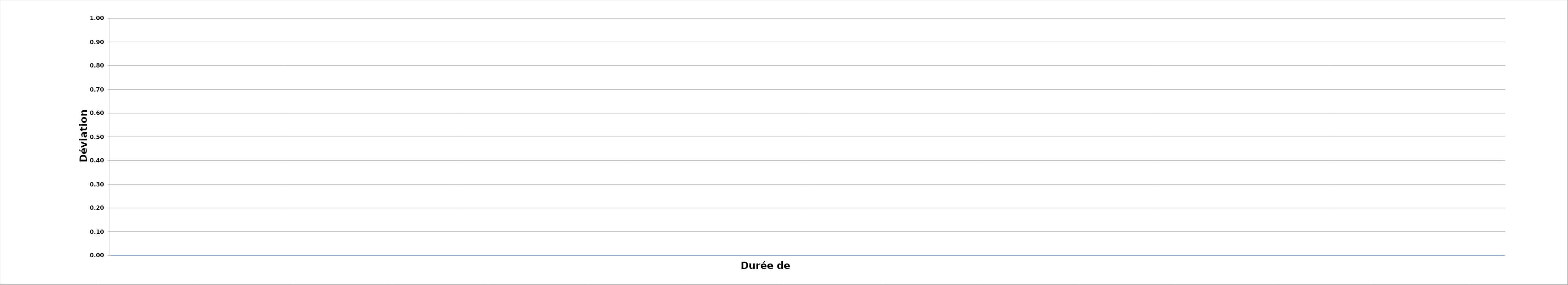
| Category | Series 0 |
|---|---|
| 0 | 0 |
| 1 | 0 |
| 2 | 0 |
| 3 | 0 |
| 4 | 0 |
| 5 | 0 |
| 6 | 0 |
| 7 | 0 |
| 8 | 0 |
| 9 | 0 |
| 10 | 0 |
| 11 | 0 |
| 12 | 0 |
| 13 | 0 |
| 14 | 0 |
| 15 | 0 |
| 16 | 0 |
| 17 | 0 |
| 18 | 0 |
| 19 | 0 |
| 20 | 0 |
| 21 | 0 |
| 22 | 0 |
| 23 | 0 |
| 24 | 0 |
| 25 | 0 |
| 26 | 0 |
| 27 | 0 |
| 28 | 0 |
| 29 | 0 |
| 30 | 0 |
| 31 | 0 |
| 32 | 0 |
| 33 | 0 |
| 34 | 0 |
| 35 | 0 |
| 36 | 0 |
| 37 | 0 |
| 38 | 0 |
| 39 | 0 |
| 40 | 0 |
| 41 | 0 |
| 42 | 0 |
| 43 | 0 |
| 44 | 0 |
| 45 | 0 |
| 46 | 0 |
| 47 | 0 |
| 48 | 0 |
| 49 | 0 |
| 50 | 0 |
| 51 | 0 |
| 52 | 0 |
| 53 | 0 |
| 54 | 0 |
| 55 | 0 |
| 56 | 0 |
| 57 | 0 |
| 58 | 0 |
| 59 | 0 |
| 60 | 0 |
| 61 | 0 |
| 62 | 0 |
| 63 | 0 |
| 64 | 0 |
| 65 | 0 |
| 66 | 0 |
| 67 | 0 |
| 68 | 0 |
| 69 | 0 |
| 70 | 0 |
| 71 | 0 |
| 72 | 0 |
| 73 | 0 |
| 74 | 0 |
| 75 | 0 |
| 76 | 0 |
| 77 | 0 |
| 78 | 0 |
| 79 | 0 |
| 80 | 0 |
| 81 | 0 |
| 82 | 0 |
| 83 | 0 |
| 84 | 0 |
| 85 | 0 |
| 86 | 0 |
| 87 | 0 |
| 88 | 0 |
| 89 | 0 |
| 90 | 0 |
| 91 | 0 |
| 92 | 0 |
| 93 | 0 |
| 94 | 0 |
| 95 | 0 |
| 96 | 0 |
| 97 | 0 |
| 98 | 0 |
| 99 | 0 |
| 100 | 0 |
| 101 | 0 |
| 102 | 0 |
| 103 | 0 |
| 104 | 0 |
| 105 | 0 |
| 106 | 0 |
| 107 | 0 |
| 108 | 0 |
| 109 | 0 |
| 110 | 0 |
| 111 | 0 |
| 112 | 0 |
| 113 | 0 |
| 114 | 0 |
| 115 | 0 |
| 116 | 0 |
| 117 | 0 |
| 118 | 0 |
| 119 | 0 |
| 120 | 0 |
| 121 | 0 |
| 122 | 0 |
| 123 | 0 |
| 124 | 0 |
| 125 | 0 |
| 126 | 0 |
| 127 | 0 |
| 128 | 0 |
| 129 | 0 |
| 130 | 0 |
| 131 | 0 |
| 132 | 0 |
| 133 | 0 |
| 134 | 0 |
| 135 | 0 |
| 136 | 0 |
| 137 | 0 |
| 138 | 0 |
| 139 | 0 |
| 140 | 0 |
| 141 | 0 |
| 142 | 0 |
| 143 | 0 |
| 144 | 0 |
| 145 | 0 |
| 146 | 0 |
| 147 | 0 |
| 148 | 0 |
| 149 | 0 |
| 150 | 0 |
| 151 | 0 |
| 152 | 0 |
| 153 | 0 |
| 154 | 0 |
| 155 | 0 |
| 156 | 0 |
| 157 | 0 |
| 158 | 0 |
| 159 | 0 |
| 160 | 0 |
| 161 | 0 |
| 162 | 0 |
| 163 | 0 |
| 164 | 0 |
| 165 | 0 |
| 166 | 0 |
| 167 | 0 |
| 168 | 0 |
| 169 | 0 |
| 170 | 0 |
| 171 | 0 |
| 172 | 0 |
| 173 | 0 |
| 174 | 0 |
| 175 | 0 |
| 176 | 0 |
| 177 | 0 |
| 178 | 0 |
| 179 | 0 |
| 180 | 0 |
| 181 | 0 |
| 182 | 0 |
| 183 | 0 |
| 184 | 0 |
| 185 | 0 |
| 186 | 0 |
| 187 | 0 |
| 188 | 0 |
| 189 | 0 |
| 190 | 0 |
| 191 | 0 |
| 192 | 0 |
| 193 | 0 |
| 194 | 0 |
| 195 | 0 |
| 196 | 0 |
| 197 | 0 |
| 198 | 0 |
| 199 | 0 |
| 200 | 0 |
| 201 | 0 |
| 202 | 0 |
| 203 | 0 |
| 204 | 0 |
| 205 | 0 |
| 206 | 0 |
| 207 | 0 |
| 208 | 0 |
| 209 | 0 |
| 210 | 0 |
| 211 | 0 |
| 212 | 0 |
| 213 | 0 |
| 214 | 0 |
| 215 | 0 |
| 216 | 0 |
| 217 | 0 |
| 218 | 0 |
| 219 | 0 |
| 220 | 0 |
| 221 | 0 |
| 222 | 0 |
| 223 | 0 |
| 224 | 0 |
| 225 | 0 |
| 226 | 0 |
| 227 | 0 |
| 228 | 0 |
| 229 | 0 |
| 230 | 0 |
| 231 | 0 |
| 232 | 0 |
| 233 | 0 |
| 234 | 0 |
| 235 | 0 |
| 236 | 0 |
| 237 | 0 |
| 238 | 0 |
| 239 | 0 |
| 240 | 0 |
| 241 | 0 |
| 242 | 0 |
| 243 | 0 |
| 244 | 0 |
| 245 | 0 |
| 246 | 0 |
| 247 | 0 |
| 248 | 0 |
| 249 | 0 |
| 250 | 0 |
| 251 | 0 |
| 252 | 0 |
| 253 | 0 |
| 254 | 0 |
| 255 | 0 |
| 256 | 0 |
| 257 | 0 |
| 258 | 0 |
| 259 | 0 |
| 260 | 0 |
| 261 | 0 |
| 262 | 0 |
| 263 | 0 |
| 264 | 0 |
| 265 | 0 |
| 266 | 0 |
| 267 | 0 |
| 268 | 0 |
| 269 | 0 |
| 270 | 0 |
| 271 | 0 |
| 272 | 0 |
| 273 | 0 |
| 274 | 0 |
| 275 | 0 |
| 276 | 0 |
| 277 | 0 |
| 278 | 0 |
| 279 | 0 |
| 280 | 0 |
| 281 | 0 |
| 282 | 0 |
| 283 | 0 |
| 284 | 0 |
| 285 | 0 |
| 286 | 0 |
| 287 | 0 |
| 288 | 0 |
| 289 | 0 |
| 290 | 0 |
| 291 | 0 |
| 292 | 0 |
| 293 | 0 |
| 294 | 0 |
| 295 | 0 |
| 296 | 0 |
| 297 | 0 |
| 298 | 0 |
| 299 | 0 |
| 300 | 0 |
| 301 | 0 |
| 302 | 0 |
| 303 | 0 |
| 304 | 0 |
| 305 | 0 |
| 306 | 0 |
| 307 | 0 |
| 308 | 0 |
| 309 | 0 |
| 310 | 0 |
| 311 | 0 |
| 312 | 0 |
| 313 | 0 |
| 314 | 0 |
| 315 | 0 |
| 316 | 0 |
| 317 | 0 |
| 318 | 0 |
| 319 | 0 |
| 320 | 0 |
| 321 | 0 |
| 322 | 0 |
| 323 | 0 |
| 324 | 0 |
| 325 | 0 |
| 326 | 0 |
| 327 | 0 |
| 328 | 0 |
| 329 | 0 |
| 330 | 0 |
| 331 | 0 |
| 332 | 0 |
| 333 | 0 |
| 334 | 0 |
| 335 | 0 |
| 336 | 0 |
| 337 | 0 |
| 338 | 0 |
| 339 | 0 |
| 340 | 0 |
| 341 | 0 |
| 342 | 0 |
| 343 | 0 |
| 344 | 0 |
| 345 | 0 |
| 346 | 0 |
| 347 | 0 |
| 348 | 0 |
| 349 | 0 |
| 350 | 0 |
| 351 | 0 |
| 352 | 0 |
| 353 | 0 |
| 354 | 0 |
| 355 | 0 |
| 356 | 0 |
| 357 | 0 |
| 358 | 0 |
| 359 | 0 |
| 360 | 0 |
| 361 | 0 |
| 362 | 0 |
| 363 | 0 |
| 364 | 0 |
| 365 | 0 |
| 366 | 0 |
| 367 | 0 |
| 368 | 0 |
| 369 | 0 |
| 370 | 0 |
| 371 | 0 |
| 372 | 0 |
| 373 | 0 |
| 374 | 0 |
| 375 | 0 |
| 376 | 0 |
| 377 | 0 |
| 378 | 0 |
| 379 | 0 |
| 380 | 0 |
| 381 | 0 |
| 382 | 0 |
| 383 | 0 |
| 384 | 0 |
| 385 | 0 |
| 386 | 0 |
| 387 | 0 |
| 388 | 0 |
| 389 | 0 |
| 390 | 0 |
| 391 | 0 |
| 392 | 0 |
| 393 | 0 |
| 394 | 0 |
| 395 | 0 |
| 396 | 0 |
| 397 | 0 |
| 398 | 0 |
| 399 | 0 |
| 400 | 0 |
| 401 | 0 |
| 402 | 0 |
| 403 | 0 |
| 404 | 0 |
| 405 | 0 |
| 406 | 0 |
| 407 | 0 |
| 408 | 0 |
| 409 | 0 |
| 410 | 0 |
| 411 | 0 |
| 412 | 0 |
| 413 | 0 |
| 414 | 0 |
| 415 | 0 |
| 416 | 0 |
| 417 | 0 |
| 418 | 0 |
| 419 | 0 |
| 420 | 0 |
| 421 | 0 |
| 422 | 0 |
| 423 | 0 |
| 424 | 0 |
| 425 | 0 |
| 426 | 0 |
| 427 | 0 |
| 428 | 0 |
| 429 | 0 |
| 430 | 0 |
| 431 | 0 |
| 432 | 0 |
| 433 | 0 |
| 434 | 0 |
| 435 | 0 |
| 436 | 0 |
| 437 | 0 |
| 438 | 0 |
| 439 | 0 |
| 440 | 0 |
| 441 | 0 |
| 442 | 0 |
| 443 | 0 |
| 444 | 0 |
| 445 | 0 |
| 446 | 0 |
| 447 | 0 |
| 448 | 0 |
| 449 | 0 |
| 450 | 0 |
| 451 | 0 |
| 452 | 0 |
| 453 | 0 |
| 454 | 0 |
| 455 | 0 |
| 456 | 0 |
| 457 | 0 |
| 458 | 0 |
| 459 | 0 |
| 460 | 0 |
| 461 | 0 |
| 462 | 0 |
| 463 | 0 |
| 464 | 0 |
| 465 | 0 |
| 466 | 0 |
| 467 | 0 |
| 468 | 0 |
| 469 | 0 |
| 470 | 0 |
| 471 | 0 |
| 472 | 0 |
| 473 | 0 |
| 474 | 0 |
| 475 | 0 |
| 476 | 0 |
| 477 | 0 |
| 478 | 0 |
| 479 | 0 |
| 480 | 0 |
| 481 | 0 |
| 482 | 0 |
| 483 | 0 |
| 484 | 0 |
| 485 | 0 |
| 486 | 0 |
| 487 | 0 |
| 488 | 0 |
| 489 | 0 |
| 490 | 0 |
| 491 | 0 |
| 492 | 0 |
| 493 | 0 |
| 494 | 0 |
| 495 | 0 |
| 496 | 0 |
| 497 | 0 |
| 498 | 0 |
| 499 | 0 |
| 500 | 0 |
| 501 | 0 |
| 502 | 0 |
| 503 | 0 |
| 504 | 0 |
| 505 | 0 |
| 506 | 0 |
| 507 | 0 |
| 508 | 0 |
| 509 | 0 |
| 510 | 0 |
| 511 | 0 |
| 512 | 0 |
| 513 | 0 |
| 514 | 0 |
| 515 | 0 |
| 516 | 0 |
| 517 | 0 |
| 518 | 0 |